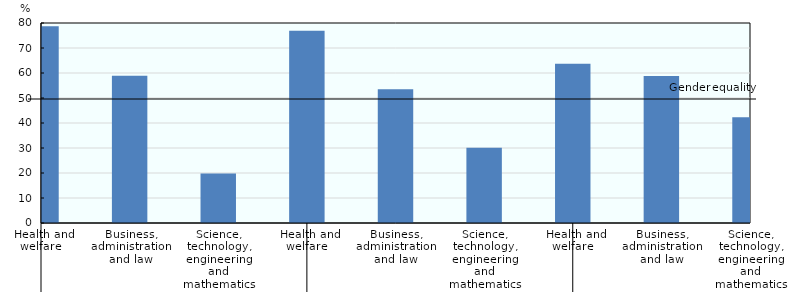
| Category | Series 0 |
|---|---|
| 0 | 78.681 |
| 1 | 58.861 |
| 2 | 19.808 |
| 3 | 76.9 |
| 4 | 53.512 |
| 5 | 30.07 |
| 6 | 63.668 |
| 7 | 58.76 |
| 8 | 42.268 |